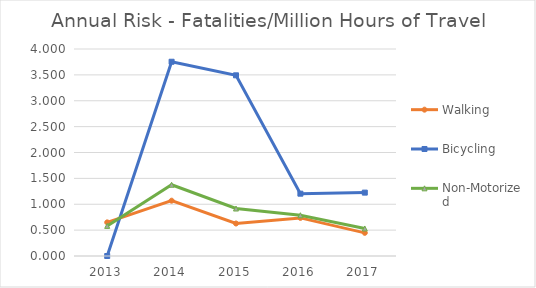
| Category | Walking | Bicycling | Non-Motorized |
|---|---|---|---|
| 2013 | 0.65 | 0 | 0.582 |
| 2014 | 1.069 | 3.754 | 1.377 |
| 2015 | 0.628 | 3.491 | 0.917 |
| 2016 | 0.736 | 1.204 | 0.787 |
| 2017 | 0.447 | 1.225 | 0.532 |